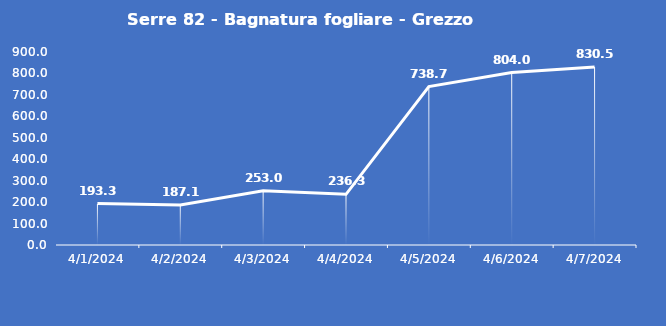
| Category | Serre 82 - Bagnatura fogliare - Grezzo (min) |
|---|---|
| 4/1/24 | 193.3 |
| 4/2/24 | 187.1 |
| 4/3/24 | 253 |
| 4/4/24 | 236.3 |
| 4/5/24 | 738.7 |
| 4/6/24 | 804 |
| 4/7/24 | 830.5 |